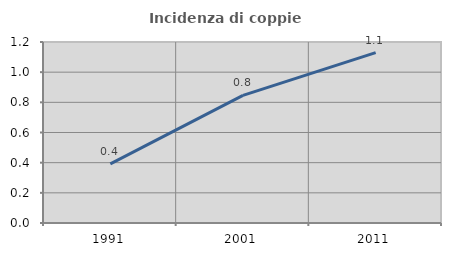
| Category | Incidenza di coppie miste |
|---|---|
| 1991.0 | 0.392 |
| 2001.0 | 0.846 |
| 2011.0 | 1.129 |